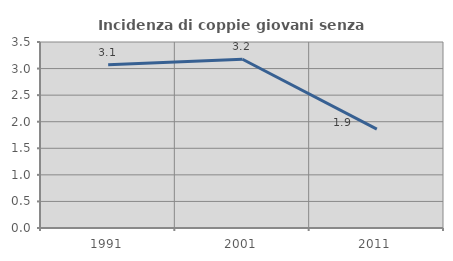
| Category | Incidenza di coppie giovani senza figli |
|---|---|
| 1991.0 | 3.073 |
| 2001.0 | 3.175 |
| 2011.0 | 1.86 |